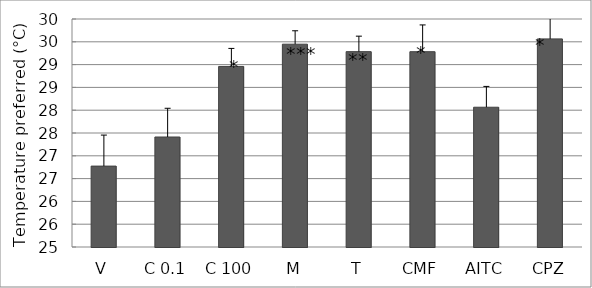
| Category | Series 0 |
|---|---|
| V | 26.774 |
| C 0.1 | 27.412 |
| C 100 | 28.96 |
| M | 29.447 |
| T | 29.284 |
| CMF | 29.283 |
| AITC | 28.065 |
| CPZ | 29.564 |